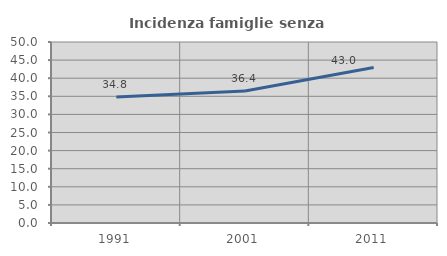
| Category | Incidenza famiglie senza nuclei |
|---|---|
| 1991.0 | 34.809 |
| 2001.0 | 36.44 |
| 2011.0 | 42.95 |